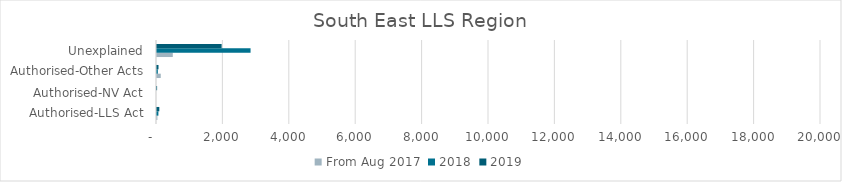
| Category | From Aug 2017 | 2018 | 2019 |
|---|---|---|---|
| Authorised-LLS Act | 12 | 42 | 70 |
| Authorised-NV Act | 0 | 0 | 3 |
| Authorised-Other Acts | 113 | 25 | 45 |
| Unexplained | 476 | 2818 | 1947 |